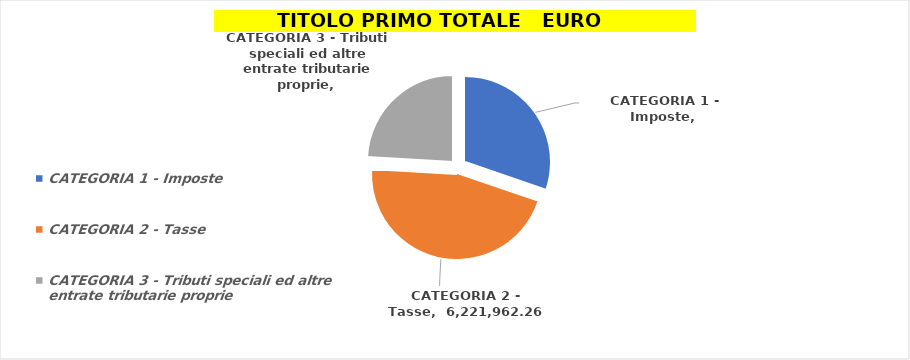
| Category | Series 0 |
|---|---|
| CATEGORIA 1 - Imposte | 4120488.52 |
| CATEGORIA 2 - Tasse | 6221962.26 |
| CATEGORIA 3 - Tributi speciali ed altre entrate tributarie proprie | 3278393.99 |